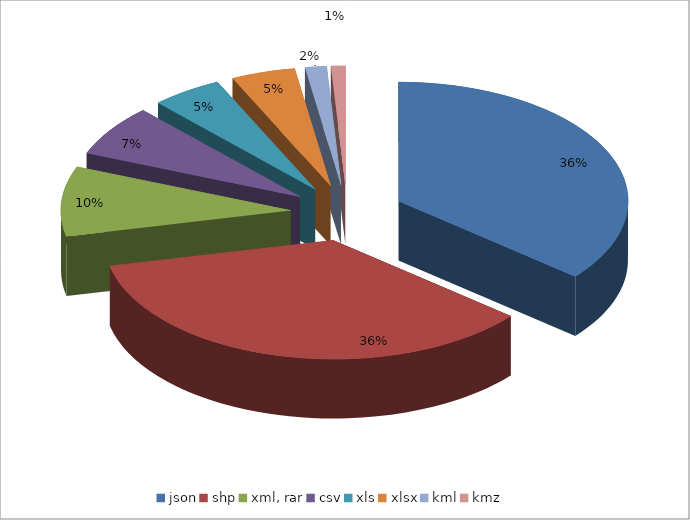
| Category | Μορφοποίηση Συνόλων Δεδομένων |
|---|---|
| json | 72 |
| shp | 71 |
| xml, rar | 19 |
| csv | 14 |
| xls | 10 |
| xlsx | 9 |
| kml | 3 |
| kmz | 2 |